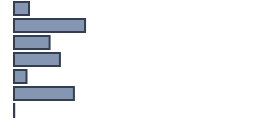
| Category | Percentatge |
|---|---|
| 0 | 6.217 |
| 1 | 29.609 |
| 2 | 14.826 |
| 3 | 19.13 |
| 4 | 5.174 |
| 5 | 24.957 |
| 6 | 0.087 |